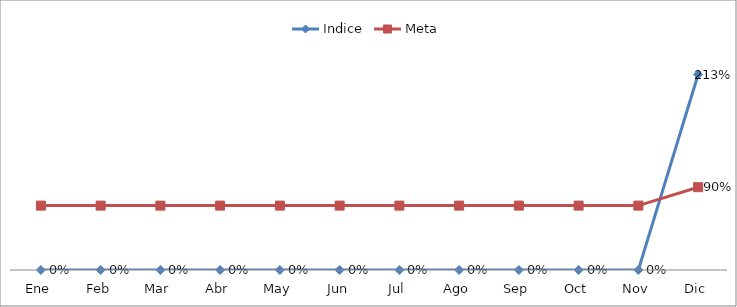
| Category | Indice | Meta |
|---|---|---|
| Ene | 0 | 0.7 |
| Feb | 0 | 0.7 |
| Mar | 0 | 0.7 |
| Abr | 0 | 0.7 |
| May | 0 | 0.7 |
| Jun | 0 | 0.7 |
| Jul | 0 | 0.7 |
| Ago | 0 | 0.7 |
| Sep | 0 | 0.7 |
| Oct | 0 | 0.7 |
| Nov | 0 | 0.7 |
| Dic | 2.125 | 0.9 |